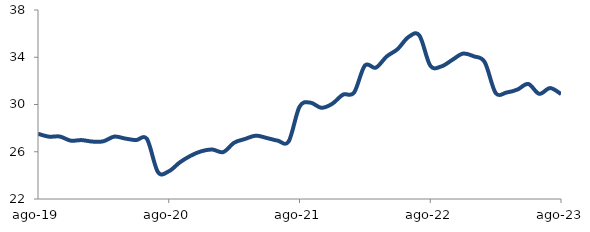
| Category | Series 0 |
|---|---|
| 2019-08-01 | 27.519 |
| 2019-09-01 | 27.279 |
| 2019-10-01 | 27.289 |
| 2019-11-01 | 26.942 |
| 2019-12-01 | 26.986 |
| 2020-01-01 | 26.86 |
| 2020-02-01 | 26.885 |
| 2020-03-01 | 27.282 |
| 2020-04-01 | 27.118 |
| 2020-05-01 | 26.986 |
| 2020-06-01 | 27.082 |
| 2020-07-01 | 24.291 |
| 2020-08-01 | 24.343 |
| 2020-09-01 | 25.089 |
| 2020-10-01 | 25.658 |
| 2020-11-01 | 26.044 |
| 2020-12-01 | 26.188 |
| 2021-01-01 | 25.972 |
| 2021-02-01 | 26.764 |
| 2021-03-01 | 27.083 |
| 2021-04-01 | 27.363 |
| 2021-05-01 | 27.164 |
| 2021-06-01 | 26.939 |
| 2021-07-01 | 26.864 |
| 2021-08-01 | 29.808 |
| 2021-09-01 | 30.158 |
| 2021-10-01 | 29.722 |
| 2021-11-01 | 30.058 |
| 2021-12-01 | 30.839 |
| 2022-01-01 | 30.999 |
| 2022-02-01 | 33.297 |
| 2022-03-01 | 33.114 |
| 2022-04-01 | 34.066 |
| 2022-05-01 | 34.685 |
| 2022-06-01 | 35.71 |
| 2022-07-01 | 35.85 |
| 2022-08-01 | 33.294 |
| 2022-09-01 | 33.218 |
| 2022-10-01 | 33.762 |
| 2022-11-01 | 34.307 |
| 2022-12-01 | 34.079 |
| 2023-01-01 | 33.585 |
| 2023-02-01 | 30.978 |
| 2023-03-01 | 31.014 |
| 2023-04-01 | 31.263 |
| 2023-05-01 | 31.74 |
| 2023-06-01 | 30.902 |
| 2023-07-01 | 31.392 |
| 2023-08-01 | 30.886 |